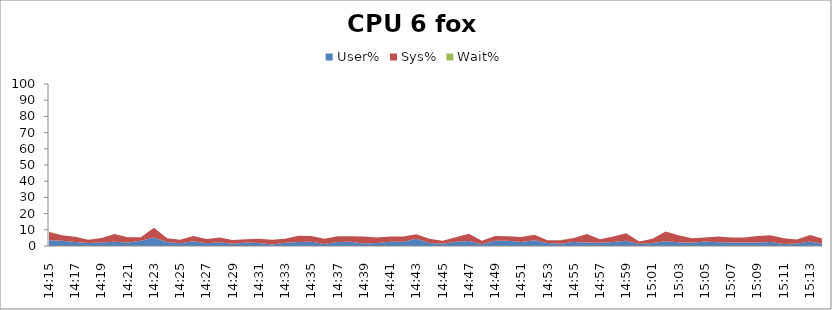
| Category | User% | Sys% | Wait% |
|---|---|---|---|
| 14:15 | 3.6 | 5 | 0.4 |
| 14:16 | 3.3 | 3.3 | 0 |
| 14:17 | 2.4 | 3.3 | 0 |
| 14:18 | 1.8 | 2.1 | 0 |
| 14:19 | 2.2 | 2.7 | 0 |
| 14:20 | 2.7 | 4.7 | 0 |
| 14:21 | 2.1 | 3.3 | 0 |
| 14:22 | 3.2 | 2.2 | 0 |
| 14:23 | 5.3 | 5.9 | 0 |
| 14:24 | 2.4 | 2.4 | 0 |
| 14:25 | 1.7 | 2.2 | 0 |
| 14:26 | 2.9 | 3.2 | 0.1 |
| 14:27 | 1.7 | 2.6 | 0 |
| 14:28 | 2.3 | 3 | 0 |
| 14:29 | 1.4 | 2.3 | 0 |
| 14:30 | 2.1 | 2 | 0 |
| 14:31 | 1.8 | 2.7 | 0 |
| 14:32 | 1 | 2.8 | 0 |
| 14:33 | 2 | 2.4 | 0 |
| 14:34 | 2.5 | 3.8 | 0 |
| 14:35 | 2.6 | 3.6 | 0 |
| 14:36 | 1.2 | 3.3 | 0 |
| 14:37 | 2.5 | 3.5 | 0 |
| 14:38 | 2.6 | 3.4 | 0 |
| 14:39 | 1.5 | 4.4 | 0 |
| 14:40 | 1.8 | 3.5 | 0 |
| 14:41 | 2.6 | 3.2 | 0 |
| 14:42 | 2.7 | 3.1 | 0 |
| 14:43 | 4.4 | 2.8 | 0.1 |
| 14:44 | 1.8 | 2.7 | 0 |
| 14:45 | 1.4 | 1.9 | 0 |
| 14:46 | 2.7 | 2.7 | 0 |
| 14:47 | 3.1 | 4.5 | 0 |
| 14:48 | 1.1 | 2.1 | 0 |
| 14:49 | 3.3 | 2.8 | 0 |
| 14:50 | 3.2 | 2.8 | 0 |
| 14:51 | 2.4 | 3.1 | 0 |
| 14:52 | 3.6 | 3.4 | 0 |
| 14:53 | 1.9 | 1.6 | 0.1 |
| 14:54 | 1.4 | 2.2 | 0.1 |
| 14:55 | 2.4 | 2.5 | 0 |
| 14:56 | 2.2 | 5.2 | 0 |
| 14:57 | 2 | 2.1 | 0 |
| 14:58 | 2.4 | 3.5 | 0 |
| 14:59 | 3.2 | 4.7 | 0 |
| 15:00 | 1.2 | 1.6 | 0 |
| 15:01 | 1.9 | 2.5 | 0 |
| 15:02 | 3 | 6 | 0 |
| 15:03 | 2.3 | 4.4 | 0 |
| 15:04 | 2 | 2.8 | 0 |
| 15:05 | 2.8 | 2.5 | 0 |
| 15:06 | 2.3 | 3.6 | 0 |
| 15:07 | 2.2 | 3.1 | 0 |
| 15:08 | 2.1 | 3.1 | 0 |
| 15:09 | 2.1 | 4 | 0 |
| 15:10 | 2.5 | 4.1 | 0 |
| 15:11 | 1.3 | 3.5 | 0 |
| 15:12 | 1.5 | 2.5 | 0 |
| 15:13 | 2.8 | 4 | 0 |
| 15:14 | 1.3 | 3.2 | 0 |